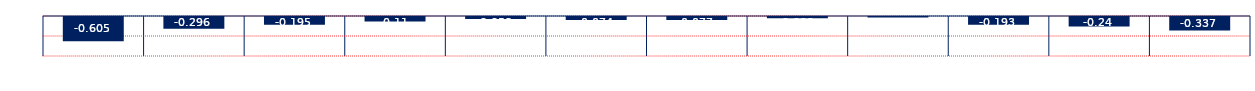
| Category | Spread |
|---|---|
| Mar 24, Jul 24 | -0.605 |
| Apr 24, Aug 24 | -0.296 |
| May 24, Sep 24 | -0.195 |
| Jun 24, Oct 24 | -0.11 |
| Jul 24, Nov 24 | -0.053 |
| Aug 24, Dec 24 | -0.074 |
| Sep 24, Jan 25 | -0.077 |
| Oct 24, Feb 25 | -0.029 |
| Nov 24, Mar 25 | -0.014 |
| Dec 24, Apr 25 | -0.193 |
| Jan 25, May 25 | -0.24 |
| Feb 25, Jun 25 | -0.337 |